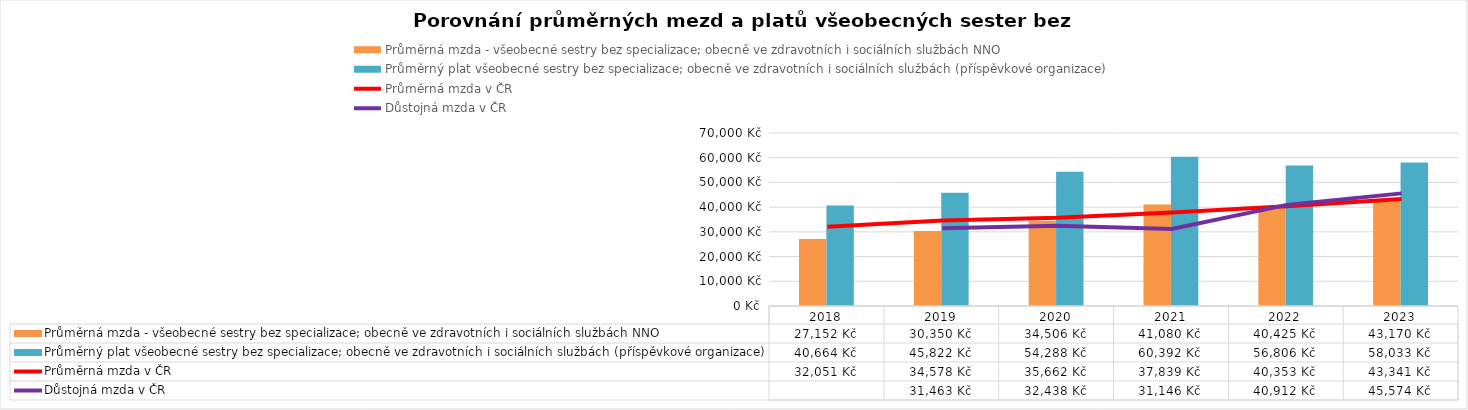
| Category | Průměrná mzda - všeobecné sestry bez specializace; obecně ve zdravotních i sociálních službách NNO | Průměrný plat všeobecné sestry bez specializace; obecně ve zdravotních i sociálních službách (příspěvkové organizace) |
|---|---|---|
| 2018.0 | 27151.706 | 40663.816 |
| 2019.0 | 30350 | 45822 |
| 2020.0 | 34506 | 54288 |
| 2021.0 | 41079.721 | 60391.859 |
| 2022.0 | 40425 | 56805.708 |
| 2023.0 | 43170 | 58033 |